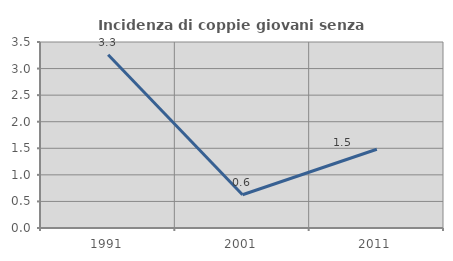
| Category | Incidenza di coppie giovani senza figli |
|---|---|
| 1991.0 | 3.261 |
| 2001.0 | 0.625 |
| 2011.0 | 1.481 |